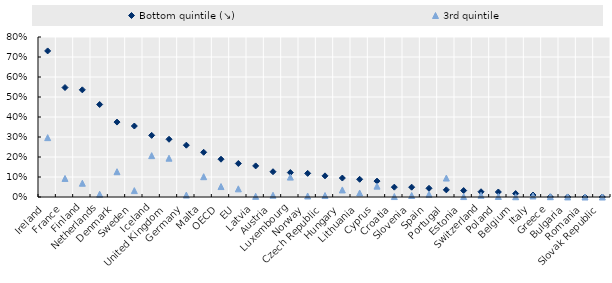
| Category | Bottom quintile (↘) | 3rd quintile |
|---|---|---|
| Ireland | 0.73 | 0.297 |
| France | 0.547 | 0.093 |
| Finland | 0.536 | 0.069 |
| Netherlands | 0.462 | 0.014 |
| Denmark | 0.375 | 0.126 |
| Sweden | 0.355 | 0.032 |
| Iceland | 0.308 | 0.207 |
| United Kingdom | 0.289 | 0.194 |
| Germany | 0.259 | 0.01 |
| Malta | 0.224 | 0.101 |
| OECD | 0.189 | 0.052 |
| EU | 0.168 | 0.041 |
| Latvia | 0.155 | 0.003 |
| Austria | 0.126 | 0.009 |
| Luxembourg | 0.122 | 0.099 |
| Norway | 0.118 | 0.005 |
| Czech Republic | 0.106 | 0.007 |
| Hungary | 0.095 | 0.035 |
| Lithuania | 0.089 | 0.02 |
| Cyprus | 0.079 | 0.054 |
| Croatia | 0.049 | 0.002 |
| Slovenia | 0.049 | 0.008 |
| Spain | 0.044 | 0.014 |
| Portugal | 0.036 | 0.095 |
| Estonia | 0.032 | 0.002 |
| Switzerland | 0.026 | 0.009 |
| Poland | 0.025 | 0.003 |
| Belgium | 0.017 | 0.001 |
| Italy | 0.01 | 0.005 |
| Greece | 0 | 0.001 |
| Bulgaria | 0 | 0 |
| Romania | 0 | 0 |
| Slovak Republic | 0 | 0 |